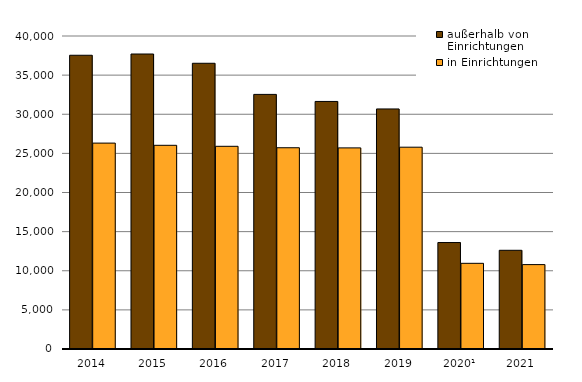
| Category | außerhalb von Einrichtungen | in Einrichtungen |
|---|---|---|
| 2014 | 37538 | 26312 |
| 2015 | 37699 | 26031 |
| 2016 | 36514 | 25903 |
| 2017 | 32536 | 25719 |
| 2018 | 31637 | 25701 |
| 2019 | 30677 | 25790 |
| 2020¹ | 13605 | 10950 |
| 2021 | 12615 | 10785 |